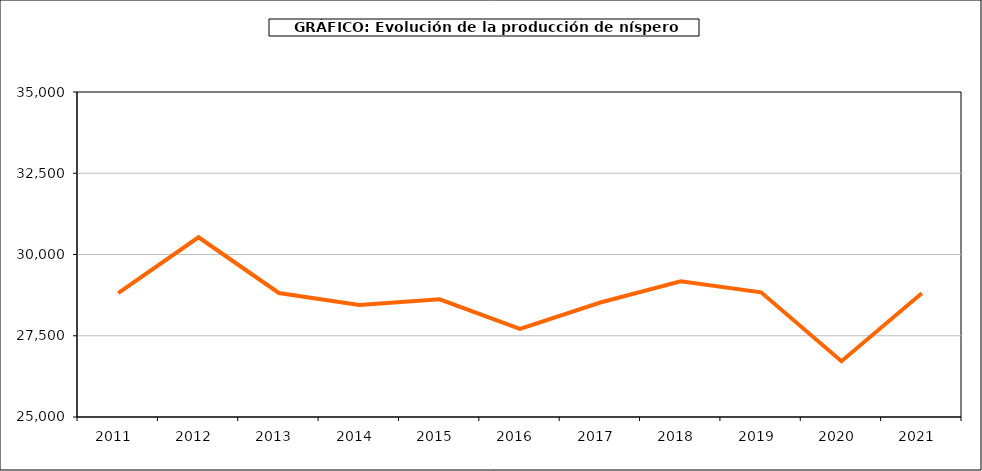
| Category | producción níspero |
|---|---|
| 2011.0 | 28812 |
| 2012.0 | 30529 |
| 2013.0 | 28815 |
| 2014.0 | 28449 |
| 2015.0 | 28620 |
| 2016.0 | 27712 |
| 2017.0 | 28522 |
| 2018.0 | 29173 |
| 2019.0 | 28836 |
| 2020.0 | 26717 |
| 2021.0 | 28805 |